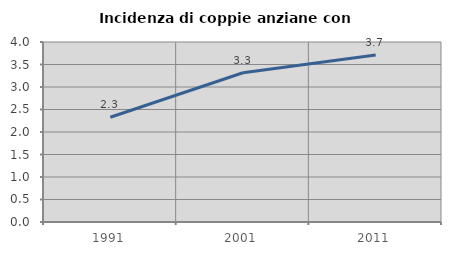
| Category | Incidenza di coppie anziane con figli |
|---|---|
| 1991.0 | 2.328 |
| 2001.0 | 3.317 |
| 2011.0 | 3.712 |